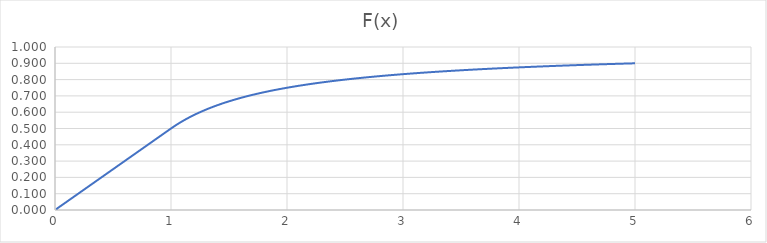
| Category | Series 0 |
|---|---|
| 0.01 | 0.005 |
| 0.02 | 0.01 |
| 0.03 | 0.015 |
| 0.04 | 0.02 |
| 0.05 | 0.025 |
| 0.06 | 0.03 |
| 0.07 | 0.035 |
| 0.08 | 0.04 |
| 0.09 | 0.045 |
| 0.1 | 0.05 |
| 0.11 | 0.055 |
| 0.12 | 0.06 |
| 0.13 | 0.065 |
| 0.14 | 0.07 |
| 0.15 | 0.075 |
| 0.16 | 0.08 |
| 0.17 | 0.085 |
| 0.18 | 0.09 |
| 0.19 | 0.095 |
| 0.2 | 0.1 |
| 0.21 | 0.105 |
| 0.22 | 0.11 |
| 0.23 | 0.115 |
| 0.24 | 0.12 |
| 0.25 | 0.125 |
| 0.26 | 0.13 |
| 0.27 | 0.135 |
| 0.28 | 0.14 |
| 0.29 | 0.145 |
| 0.3 | 0.15 |
| 0.31 | 0.155 |
| 0.32 | 0.16 |
| 0.33 | 0.165 |
| 0.34 | 0.17 |
| 0.35 | 0.175 |
| 0.36 | 0.18 |
| 0.37 | 0.185 |
| 0.38 | 0.19 |
| 0.39 | 0.195 |
| 0.4 | 0.2 |
| 0.41 | 0.205 |
| 0.42 | 0.21 |
| 0.43 | 0.215 |
| 0.44 | 0.22 |
| 0.45 | 0.225 |
| 0.46 | 0.23 |
| 0.47 | 0.235 |
| 0.48 | 0.24 |
| 0.49 | 0.245 |
| 0.5 | 0.25 |
| 0.51 | 0.255 |
| 0.52 | 0.26 |
| 0.53 | 0.265 |
| 0.54 | 0.27 |
| 0.55 | 0.275 |
| 0.56 | 0.28 |
| 0.57 | 0.285 |
| 0.58 | 0.29 |
| 0.59 | 0.295 |
| 0.6 | 0.3 |
| 0.61 | 0.305 |
| 0.62 | 0.31 |
| 0.63 | 0.315 |
| 0.64 | 0.32 |
| 0.65 | 0.325 |
| 0.66 | 0.33 |
| 0.67 | 0.335 |
| 0.68 | 0.34 |
| 0.69 | 0.345 |
| 0.7 | 0.35 |
| 0.71 | 0.355 |
| 0.72 | 0.36 |
| 0.73 | 0.365 |
| 0.74 | 0.37 |
| 0.75 | 0.375 |
| 0.76 | 0.38 |
| 0.77 | 0.385 |
| 0.78 | 0.39 |
| 0.79 | 0.395 |
| 0.8 | 0.4 |
| 0.81 | 0.405 |
| 0.82 | 0.41 |
| 0.83 | 0.415 |
| 0.84 | 0.42 |
| 0.85 | 0.425 |
| 0.86 | 0.43 |
| 0.87 | 0.435 |
| 0.88 | 0.44 |
| 0.89 | 0.445 |
| 0.9 | 0.45 |
| 0.91 | 0.455 |
| 0.92 | 0.46 |
| 0.93 | 0.465 |
| 0.94 | 0.47 |
| 0.95 | 0.475 |
| 0.96 | 0.48 |
| 0.97 | 0.485 |
| 0.98 | 0.49 |
| 0.99 | 0.495 |
| 1.0 | 0.5 |
| 1.01 | 0.505 |
| 1.02 | 0.51 |
| 1.03 | 0.515 |
| 1.04 | 0.519 |
| 1.05 | 0.524 |
| 1.06 | 0.528 |
| 1.07 | 0.533 |
| 1.08 | 0.537 |
| 1.09 | 0.541 |
| 1.1 | 0.545 |
| 1.11 | 0.55 |
| 1.12 | 0.554 |
| 1.13 | 0.558 |
| 1.14 | 0.561 |
| 1.15 | 0.565 |
| 1.16 | 0.569 |
| 1.17 | 0.573 |
| 1.18 | 0.576 |
| 1.19 | 0.58 |
| 1.2 | 0.583 |
| 1.21 | 0.587 |
| 1.22 | 0.59 |
| 1.23 | 0.593 |
| 1.24 | 0.597 |
| 1.25 | 0.6 |
| 1.26 | 0.603 |
| 1.27 | 0.606 |
| 1.28 | 0.609 |
| 1.29 | 0.612 |
| 1.3 | 0.615 |
| 1.31 | 0.618 |
| 1.32 | 0.621 |
| 1.33 | 0.624 |
| 1.34 | 0.627 |
| 1.35 | 0.63 |
| 1.36 | 0.632 |
| 1.37 | 0.635 |
| 1.38 | 0.638 |
| 1.39 | 0.64 |
| 1.4 | 0.643 |
| 1.41 | 0.645 |
| 1.42 | 0.648 |
| 1.43 | 0.65 |
| 1.44 | 0.653 |
| 1.45 | 0.655 |
| 1.46 | 0.658 |
| 1.47 | 0.66 |
| 1.48 | 0.662 |
| 1.49 | 0.664 |
| 1.5 | 0.667 |
| 1.51 | 0.669 |
| 1.52 | 0.671 |
| 1.53 | 0.673 |
| 1.54 | 0.675 |
| 1.55 | 0.677 |
| 1.56 | 0.679 |
| 1.57 | 0.682 |
| 1.58 | 0.684 |
| 1.59 | 0.686 |
| 1.6 | 0.688 |
| 1.61 | 0.689 |
| 1.62 | 0.691 |
| 1.63 | 0.693 |
| 1.64 | 0.695 |
| 1.65 | 0.697 |
| 1.66 | 0.699 |
| 1.67 | 0.701 |
| 1.68 | 0.702 |
| 1.69 | 0.704 |
| 1.7 | 0.706 |
| 1.71 | 0.708 |
| 1.72 | 0.709 |
| 1.73 | 0.711 |
| 1.74 | 0.713 |
| 1.75 | 0.714 |
| 1.76 | 0.716 |
| 1.77 | 0.718 |
| 1.78 | 0.719 |
| 1.79 | 0.721 |
| 1.8 | 0.722 |
| 1.81 | 0.724 |
| 1.82 | 0.725 |
| 1.83 | 0.727 |
| 1.84 | 0.728 |
| 1.85 | 0.73 |
| 1.86 | 0.731 |
| 1.87 | 0.733 |
| 1.88 | 0.734 |
| 1.89 | 0.735 |
| 1.9 | 0.737 |
| 1.91 | 0.738 |
| 1.92 | 0.74 |
| 1.93 | 0.741 |
| 1.94 | 0.742 |
| 1.95 | 0.744 |
| 1.96 | 0.745 |
| 1.97 | 0.746 |
| 1.98 | 0.747 |
| 1.99 | 0.749 |
| 2.0 | 0.75 |
| 2.01 | 0.751 |
| 2.02 | 0.752 |
| 2.03 | 0.754 |
| 2.04 | 0.755 |
| 2.05 | 0.756 |
| 2.06 | 0.757 |
| 2.07 | 0.758 |
| 2.08 | 0.76 |
| 2.09 | 0.761 |
| 2.1 | 0.762 |
| 2.11 | 0.763 |
| 2.12 | 0.764 |
| 2.13 | 0.765 |
| 2.14 | 0.766 |
| 2.15 | 0.767 |
| 2.16 | 0.769 |
| 2.17 | 0.77 |
| 2.18 | 0.771 |
| 2.19 | 0.772 |
| 2.2 | 0.773 |
| 2.21 | 0.774 |
| 2.22 | 0.775 |
| 2.23 | 0.776 |
| 2.24 | 0.777 |
| 2.25 | 0.778 |
| 2.26 | 0.779 |
| 2.27 | 0.78 |
| 2.28 | 0.781 |
| 2.29 | 0.782 |
| 2.3 | 0.783 |
| 2.31 | 0.784 |
| 2.32 | 0.784 |
| 2.33 | 0.785 |
| 2.34 | 0.786 |
| 2.35 | 0.787 |
| 2.36 | 0.788 |
| 2.37 | 0.789 |
| 2.38 | 0.79 |
| 2.39 | 0.791 |
| 2.4 | 0.792 |
| 2.41 | 0.793 |
| 2.42 | 0.793 |
| 2.43 | 0.794 |
| 2.44 | 0.795 |
| 2.45 | 0.796 |
| 2.46 | 0.797 |
| 2.47 | 0.798 |
| 2.48 | 0.798 |
| 2.49 | 0.799 |
| 2.5 | 0.8 |
| 2.51 | 0.801 |
| 2.52 | 0.802 |
| 2.53 | 0.802 |
| 2.54 | 0.803 |
| 2.55 | 0.804 |
| 2.56 | 0.805 |
| 2.57 | 0.805 |
| 2.58 | 0.806 |
| 2.59 | 0.807 |
| 2.6 | 0.808 |
| 2.61 | 0.808 |
| 2.62 | 0.809 |
| 2.63 | 0.81 |
| 2.64 | 0.811 |
| 2.65 | 0.811 |
| 2.66 | 0.812 |
| 2.67 | 0.813 |
| 2.68 | 0.813 |
| 2.69 | 0.814 |
| 2.7 | 0.815 |
| 2.71 | 0.815 |
| 2.72 | 0.816 |
| 2.73 | 0.817 |
| 2.74 | 0.818 |
| 2.75 | 0.818 |
| 2.76 | 0.819 |
| 2.77 | 0.819 |
| 2.78 | 0.82 |
| 2.79 | 0.821 |
| 2.8 | 0.821 |
| 2.81 | 0.822 |
| 2.82 | 0.823 |
| 2.83 | 0.823 |
| 2.84 | 0.824 |
| 2.85 | 0.825 |
| 2.86 | 0.825 |
| 2.87 | 0.826 |
| 2.88 | 0.826 |
| 2.89 | 0.827 |
| 2.9 | 0.828 |
| 2.91 | 0.828 |
| 2.92 | 0.829 |
| 2.93 | 0.829 |
| 2.94 | 0.83 |
| 2.95 | 0.831 |
| 2.96 | 0.831 |
| 2.97 | 0.832 |
| 2.98 | 0.832 |
| 2.99 | 0.833 |
| 3.0 | 0.833 |
| 3.01 | 0.834 |
| 3.02 | 0.834 |
| 3.03 | 0.835 |
| 3.04 | 0.836 |
| 3.05 | 0.836 |
| 3.06 | 0.837 |
| 3.07 | 0.837 |
| 3.08 | 0.838 |
| 3.09 | 0.838 |
| 3.1 | 0.839 |
| 3.11 | 0.839 |
| 3.12 | 0.84 |
| 3.13 | 0.84 |
| 3.14 | 0.841 |
| 3.15 | 0.841 |
| 3.16 | 0.842 |
| 3.17 | 0.842 |
| 3.18 | 0.843 |
| 3.19 | 0.843 |
| 3.2 | 0.844 |
| 3.21 | 0.844 |
| 3.22 | 0.845 |
| 3.23 | 0.845 |
| 3.24 | 0.846 |
| 3.25 | 0.846 |
| 3.26 | 0.847 |
| 3.27 | 0.847 |
| 3.28 | 0.848 |
| 3.29 | 0.848 |
| 3.3 | 0.848 |
| 3.31 | 0.849 |
| 3.32 | 0.849 |
| 3.33 | 0.85 |
| 3.34 | 0.85 |
| 3.35 | 0.851 |
| 3.36 | 0.851 |
| 3.37 | 0.852 |
| 3.38 | 0.852 |
| 3.39 | 0.853 |
| 3.4 | 0.853 |
| 3.41 | 0.853 |
| 3.42 | 0.854 |
| 3.43 | 0.854 |
| 3.44 | 0.855 |
| 3.45 | 0.855 |
| 3.46 | 0.855 |
| 3.47 | 0.856 |
| 3.48 | 0.856 |
| 3.49 | 0.857 |
| 3.5 | 0.857 |
| 3.51 | 0.858 |
| 3.52 | 0.858 |
| 3.53 | 0.858 |
| 3.54 | 0.859 |
| 3.55 | 0.859 |
| 3.56 | 0.86 |
| 3.57 | 0.86 |
| 3.58 | 0.86 |
| 3.59 | 0.861 |
| 3.6 | 0.861 |
| 3.61 | 0.861 |
| 3.62 | 0.862 |
| 3.63 | 0.862 |
| 3.64 | 0.863 |
| 3.65 | 0.863 |
| 3.66 | 0.863 |
| 3.67 | 0.864 |
| 3.68 | 0.864 |
| 3.69 | 0.864 |
| 3.7 | 0.865 |
| 3.71 | 0.865 |
| 3.72 | 0.866 |
| 3.73 | 0.866 |
| 3.74 | 0.866 |
| 3.75 | 0.867 |
| 3.76 | 0.867 |
| 3.77 | 0.867 |
| 3.78 | 0.868 |
| 3.79 | 0.868 |
| 3.8 | 0.868 |
| 3.81 | 0.869 |
| 3.82 | 0.869 |
| 3.83 | 0.869 |
| 3.84 | 0.87 |
| 3.85 | 0.87 |
| 3.86 | 0.87 |
| 3.87 | 0.871 |
| 3.88 | 0.871 |
| 3.89 | 0.871 |
| 3.9 | 0.872 |
| 3.91 | 0.872 |
| 3.92 | 0.872 |
| 3.93 | 0.873 |
| 3.94 | 0.873 |
| 3.95 | 0.873 |
| 3.96 | 0.874 |
| 3.97 | 0.874 |
| 3.98 | 0.874 |
| 3.99 | 0.875 |
| 4.0 | 0.875 |
| 4.01 | 0.875 |
| 4.02 | 0.876 |
| 4.03 | 0.876 |
| 4.04 | 0.876 |
| 4.05 | 0.877 |
| 4.06 | 0.877 |
| 4.07 | 0.877 |
| 4.08 | 0.877 |
| 4.09 | 0.878 |
| 4.1 | 0.878 |
| 4.11 | 0.878 |
| 4.12 | 0.879 |
| 4.13 | 0.879 |
| 4.14 | 0.879 |
| 4.15 | 0.88 |
| 4.16 | 0.88 |
| 4.17 | 0.88 |
| 4.18 | 0.88 |
| 4.19 | 0.881 |
| 4.2 | 0.881 |
| 4.21 | 0.881 |
| 4.22 | 0.882 |
| 4.23 | 0.882 |
| 4.24 | 0.882 |
| 4.25 | 0.882 |
| 4.26 | 0.883 |
| 4.27 | 0.883 |
| 4.28 | 0.883 |
| 4.29 | 0.883 |
| 4.3 | 0.884 |
| 4.31 | 0.884 |
| 4.32 | 0.884 |
| 4.33 | 0.885 |
| 4.34 | 0.885 |
| 4.35 | 0.885 |
| 4.36 | 0.885 |
| 4.37 | 0.886 |
| 4.38 | 0.886 |
| 4.39 | 0.886 |
| 4.4 | 0.886 |
| 4.41 | 0.887 |
| 4.42 | 0.887 |
| 4.43 | 0.887 |
| 4.44 | 0.887 |
| 4.45 | 0.888 |
| 4.46 | 0.888 |
| 4.47 | 0.888 |
| 4.48 | 0.888 |
| 4.49 | 0.889 |
| 4.5 | 0.889 |
| 4.51 | 0.889 |
| 4.52 | 0.889 |
| 4.53 | 0.89 |
| 4.54 | 0.89 |
| 4.55 | 0.89 |
| 4.56 | 0.89 |
| 4.57 | 0.891 |
| 4.58 | 0.891 |
| 4.59 | 0.891 |
| 4.6 | 0.891 |
| 4.61 | 0.892 |
| 4.62 | 0.892 |
| 4.63 | 0.892 |
| 4.64 | 0.892 |
| 4.65 | 0.892 |
| 4.66 | 0.893 |
| 4.67 | 0.893 |
| 4.68 | 0.893 |
| 4.69 | 0.893 |
| 4.7 | 0.894 |
| 4.71 | 0.894 |
| 4.72 | 0.894 |
| 4.73 | 0.894 |
| 4.74 | 0.895 |
| 4.75 | 0.895 |
| 4.76 | 0.895 |
| 4.77 | 0.895 |
| 4.78 | 0.895 |
| 4.79 | 0.896 |
| 4.8 | 0.896 |
| 4.81 | 0.896 |
| 4.82 | 0.896 |
| 4.83 | 0.896 |
| 4.84 | 0.897 |
| 4.85 | 0.897 |
| 4.86 | 0.897 |
| 4.87 | 0.897 |
| 4.88 | 0.898 |
| 4.89 | 0.898 |
| 4.9 | 0.898 |
| 4.91 | 0.898 |
| 4.92 | 0.898 |
| 4.93 | 0.899 |
| 4.94 | 0.899 |
| 4.95 | 0.899 |
| 4.96 | 0.899 |
| 4.97 | 0.899 |
| 4.98 | 0.9 |
| 4.99 | 0.9 |
| 5.0 | 0.9 |